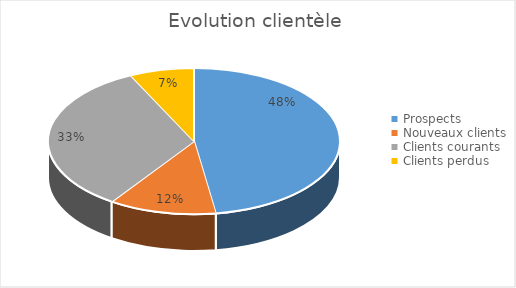
| Category | Series 0 |
|---|---|
| Prospects | 0.476 |
| Nouveaux clients | 0.119 |
| Clients courants | 0.333 |
| Clients perdus | 0.071 |